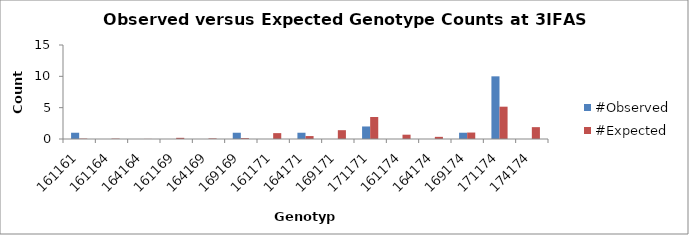
| Category | #Observed | #Expected |
|---|---|---|
| 161161.0 | 1 | 0.062 |
| 161164.0 | 0 | 0.062 |
| 164164.0 | 0 | 0.016 |
| 161169.0 | 0 | 0.188 |
| 164169.0 | 0 | 0.094 |
| 169169.0 | 1 | 0.141 |
| 161171.0 | 0 | 0.938 |
| 164171.0 | 1 | 0.469 |
| 169171.0 | 0 | 1.406 |
| 171171.0 | 2 | 3.516 |
| 161174.0 | 0 | 0.688 |
| 164174.0 | 0 | 0.344 |
| 169174.0 | 1 | 1.031 |
| 171174.0 | 10 | 5.156 |
| 174174.0 | 0 | 1.891 |